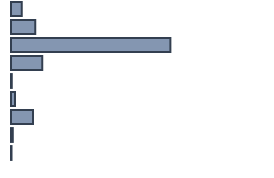
| Category | 4,2 |
|---|---|
| 0 | 4.2 |
| 1 | 9.5 |
| 2 | 62.5 |
| 3 | 12.3 |
| 4 | 0.3 |
| 5 | 1.6 |
| 6 | 8.6 |
| 7 | 0.7 |
| 8 | 0.2 |